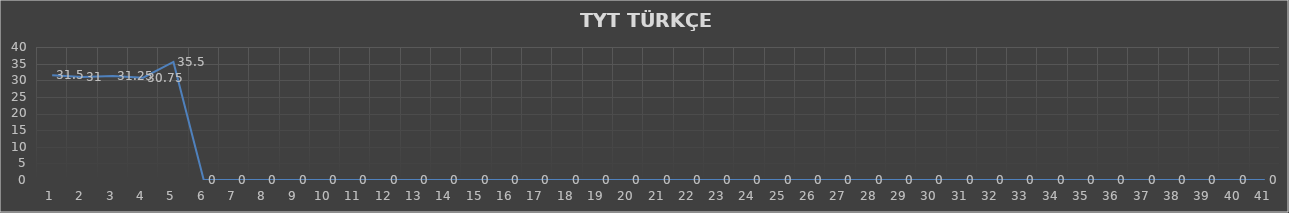
| Category | Series 0 |
|---|---|
| 0 | 31.5 |
| 1 | 31 |
| 2 | 31.25 |
| 3 | 30.75 |
| 4 | 35.5 |
| 5 | 0 |
| 6 | 0 |
| 7 | 0 |
| 8 | 0 |
| 9 | 0 |
| 10 | 0 |
| 11 | 0 |
| 12 | 0 |
| 13 | 0 |
| 14 | 0 |
| 15 | 0 |
| 16 | 0 |
| 17 | 0 |
| 18 | 0 |
| 19 | 0 |
| 20 | 0 |
| 21 | 0 |
| 22 | 0 |
| 23 | 0 |
| 24 | 0 |
| 25 | 0 |
| 26 | 0 |
| 27 | 0 |
| 28 | 0 |
| 29 | 0 |
| 30 | 0 |
| 31 | 0 |
| 32 | 0 |
| 33 | 0 |
| 34 | 0 |
| 35 | 0 |
| 36 | 0 |
| 37 | 0 |
| 38 | 0 |
| 39 | 0 |
| 40 | 0 |